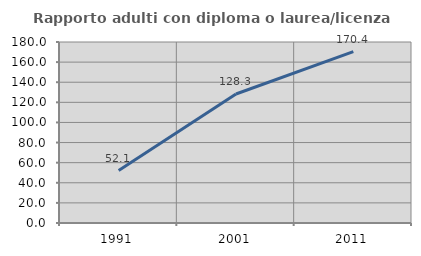
| Category | Rapporto adulti con diploma o laurea/licenza media  |
|---|---|
| 1991.0 | 52.113 |
| 2001.0 | 128.261 |
| 2011.0 | 170.37 |